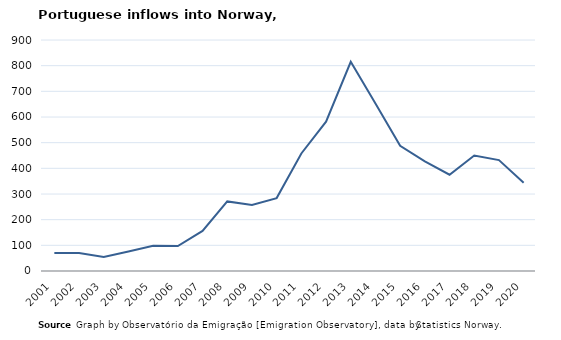
| Category | Entradas |
|---|---|
| 2001.0 | 70 |
| 2002.0 | 70 |
| 2003.0 | 55 |
| 2004.0 | 76 |
| 2005.0 | 98 |
| 2006.0 | 97 |
| 2007.0 | 156 |
| 2008.0 | 271 |
| 2009.0 | 257 |
| 2010.0 | 284 |
| 2011.0 | 458 |
| 2012.0 | 582 |
| 2013.0 | 815 |
| 2014.0 | 653 |
| 2015.0 | 488 |
| 2016.0 | 427 |
| 2017.0 | 375 |
| 2018.0 | 450 |
| 2019.0 | 432 |
| 2020.0 | 344 |